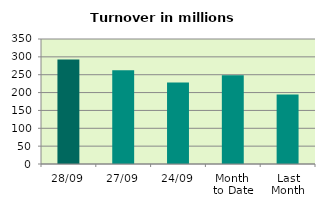
| Category | Series 0 |
|---|---|
| 28/09 | 292.765 |
| 27/09 | 262.382 |
| 24/09 | 228.384 |
| Month 
to Date | 248.206 |
| Last
Month | 194.848 |